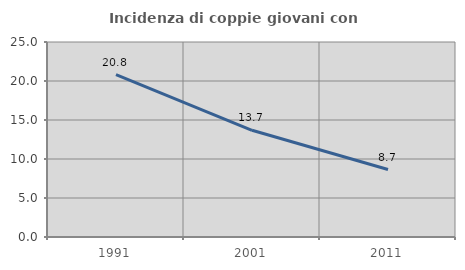
| Category | Incidenza di coppie giovani con figli |
|---|---|
| 1991.0 | 20.803 |
| 2001.0 | 13.682 |
| 2011.0 | 8.651 |